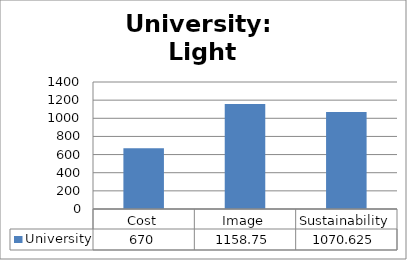
| Category | University |
|---|---|
| Cost | 670 |
| Image | 1158.75 |
| Sustainability | 1070.625 |